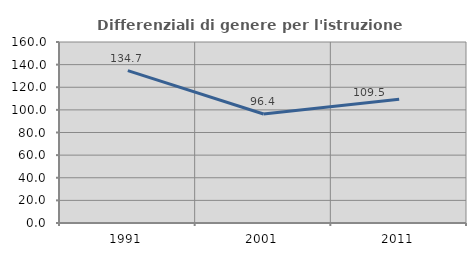
| Category | Differenziali di genere per l'istruzione superiore |
|---|---|
| 1991.0 | 134.703 |
| 2001.0 | 96.366 |
| 2011.0 | 109.461 |